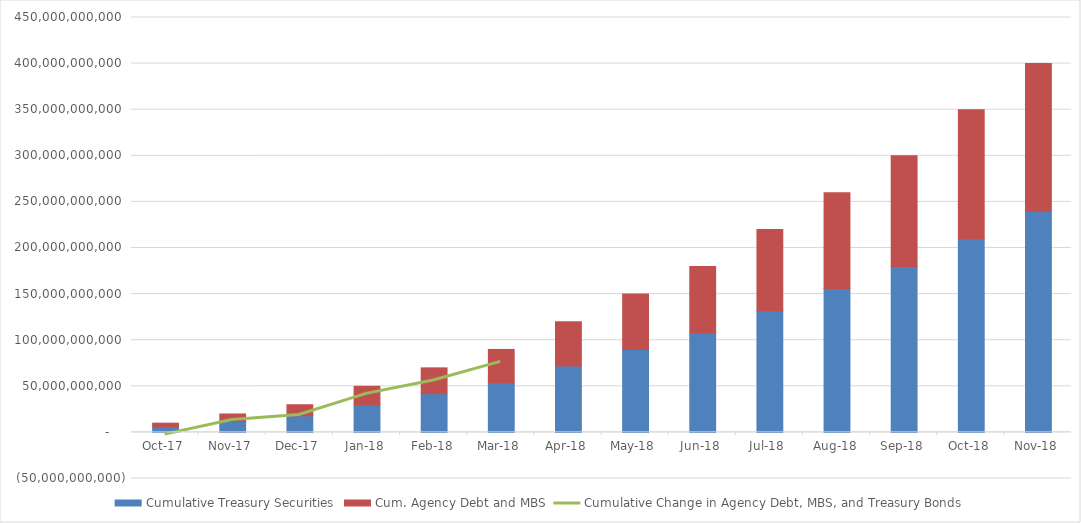
| Category | Cumulative Treasury Securities | Cum. Agency Debt and MBS |
|---|---|---|
| 2017-10-31 | 6000000000 | 4000000000 |
| 2017-11-30 | 12000000000 | 8000000000 |
| 2017-12-31 | 18000000000 | 12000000000 |
| 2018-01-31 | 30000000000 | 20000000000 |
| 2018-02-28 | 42000000000 | 28000000000 |
| 2018-03-31 | 54000000000 | 36000000000 |
| 2018-04-30 | 72000000000 | 48000000000 |
| 2018-05-31 | 90000000000 | 60000000000 |
| 2018-06-30 | 108000000000 | 72000000000 |
| 2018-07-31 | 132000000000 | 88000000000 |
| 2018-08-31 | 156000000000 | 104000000000 |
| 2018-09-30 | 180000000000 | 120000000000 |
| 2018-10-31 | 210000000000 | 140000000000 |
| 2018-11-30 | 240000000000 | 160000000000 |